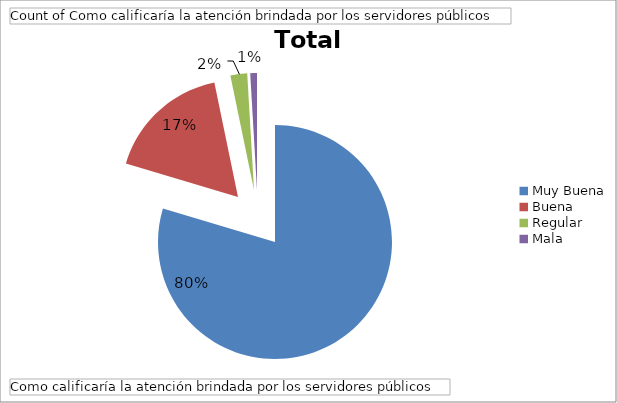
| Category | Total |
|---|---|
| Muy Buena | 172 |
| Buena | 37 |
| Regular | 5 |
| Mala | 2 |